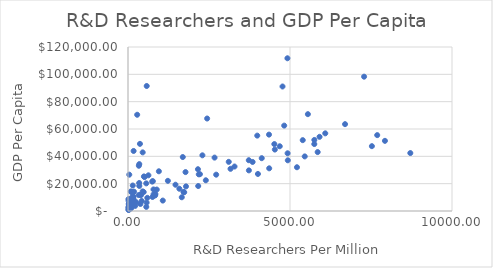
| Category | GDP Per Capita |
|---|---|
| 155.52783 | 9913.951 |
| 168.71935 | 10566.373 |
| 819.3427 | 11809.483 |
| 18.81599 | 7488.139 |
| 1230.754 | 22071.748 |
| 4532.4014 | 44965.395 |
| 5751.3228 | 51988.414 |
| 1734.8549 | 13726.77 |
| 368.99127 | 49117.99 |
| 1465.7135 | 19225.574 |
| 5750.144 | 48978.934 |
| 163.80159 | 6499.818 |
| 451.9908 | 14358.987 |
| 185.20781 | 14144.519 |
| 887.67847 | 15695.644 |
| 283.50208 | 70415.42 |
| 2402.12 | 22483.598 |
| 47.57672 | 1661.872 |
| 23.43546 | 740.448 |
| 30.36704 | 3565.245 |
| 4516.304 | 48962.48 |
| 123.48752 | 5961.996 |
| 57.89175 | 1683.478 |
| 510.30933 | 24816.611 |
| 1584.8651 | 16296.779 |
| 88.0191 | 14334.915 |
| 32.5349 | 4390.563 |
| 345.03857 | 20503.277 |
| 69.13831 | 3391.712 |
| 2219.8313 | 26950.719 |
| 1690.835 | 39471.582 |
| 4127.9336 | 38639.98 |
| 10.56469 | 1032.572 |
| 7691.8936 | 55518.598 |
| 399.48996 | 12073.811 |
| 837.97974 | 11380.847 |
| 72.98305 | 9021.426 |
| 3846.1104 | 35883.266 |
| 142.3435 | 8088.734 |
| 90.52892 | 1987.969 |
| 7527.361 | 47443.902 |
| 4926.189 | 42233.14 |
| 52.89256 | 2012.591 |
| 1712.4452 | 13966.326 |
| 5393.1455 | 51840.33 |
| 89.11206 | 4616.62 |
| 3731.0457 | 29721.586 |
| 4010.3408 | 27103.541 |
| 14.44703 | 8671.703 |
| 22.38581 | 5180.186 |
| 34.68019 | 5447.699 |
| 4352.152 | 55888.688 |
| 4357.916 | 31231.596 |
| 6088.271 | 56816.363 |
| 252.70392 | 6436.153 |
| 395.6663 | 11515.74 |
| 141.41937 | 8919.798 |
| 4769.1416 | 91099.75 |
| 2671.8347 | 39065.28 |
| 5454.683 | 39935.465 |
| 595.96295 | 9629.103 |
| 629.8512 | 26110.53 |
| 221.38593 | 3735.793 |
| 173.5131 | 43922.63 |
| 15.83763 | 3043.483 |
| 2158.84 | 30568.502 |
| 24.1134 | 2625.637 |
| 3728.48 | 37166.41 |
| 4920.301 | 111751.31 |
| 3989.5278 | 55158.71 |
| 34.04118 | 1557.322 |
| 50.3521 | 1357.872 |
| 2184.7224 | 26835.81 |
| 58.31205 | 2219.047 |
| 2296.4922 | 40740.97 |
| 563.9118 | 20224.223 |
| 348.7546 | 18327.99 |
| 788.56976 | 12201.778 |
| 330.99268 | 11666.779 |
| 746.83075 | 21537.809 |
| 1073.5403 | 7632.186 |
| 42.96538 | 1271.962 |
| 31.85088 | 4947.094 |
| 149.46625 | 10554.564 |
| 60.6658 | 2055.723 |
| 5911.687 | 54275.004 |
| 5853.9893 | 43110.37 |
| 70.42748 | 3555.97 |
| 38.78981 | 4231.764 |
| 786.6422 | 15782.548 |
| 6698.835 | 63548 |
| 334.91586 | 33098.21 |
| 382.89233 | 5157.546 |
| 575.10944 | 6118.257 |
| 39.10899 | 26576.863 |
| 35.48821 | 3924.356 |
| 155.57938 | 13609.723 |
| 173.64049 | 8365.732 |
| 3288.1675 | 32546.826 |
| 5214.8467 | 32011.324 |
| 348.36426 | 34311.04 |
| 577.3485 | 91461.62 |
| 952.869 | 29062.473 |
| 2721.6807 | 26583.797 |
| 58.7632 | 2191.402 |
| 453.1527 | 42891.688 |
| 564.3395 | 3012.383 |
| 2167.1104 | 18265.967 |
| 146.64742 | 18649.684 |
| 7286.8667 | 98283.31 |
| 3164.31 | 30867.973 |
| 4932.326 | 37098.12 |
| 484.28003 | 13852.206 |
| 8713.594 | 42396.76 |
| 3109.2437 | 35967.89 |
| 105.61143 | 13753.055 |
| 7930.181 | 51331.28 |
| 5551.9697 | 70857.086 |
| 19.15202 | 2171.442 |
| 1790.1466 | 18003.672 |
| 45.63868 | 2066.971 |
| 491.76578 | 25306.617 |
| 1659.9232 | 10050.046 |
| 1775.347 | 28473.205 |
| 27.84496 | 2067.795 |
| 846.2485 | 12407.79 |
| 2442.5374 | 67668.29 |
| 4683.7656 | 47362.266 |
| 4821.2275 | 62478.254 |
| 767.1869 | 21828.64 |
| 423.94196 | 7344.22 |
| 756.6909 | 10252.005 |
| 41.71683 | 2746.49 |
| 99.5185 | 2310.807 |